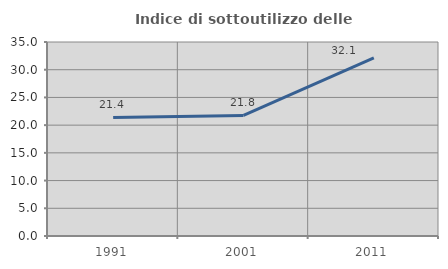
| Category | Indice di sottoutilizzo delle abitazioni  |
|---|---|
| 1991.0 | 21.386 |
| 2001.0 | 21.761 |
| 2011.0 | 32.13 |